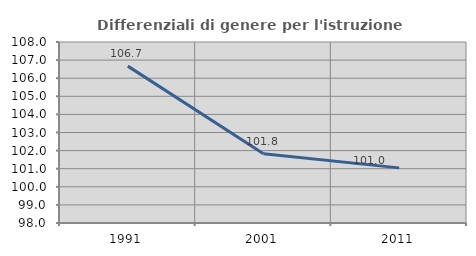
| Category | Differenziali di genere per l'istruzione superiore |
|---|---|
| 1991.0 | 106.667 |
| 2001.0 | 101.824 |
| 2011.0 | 101.046 |